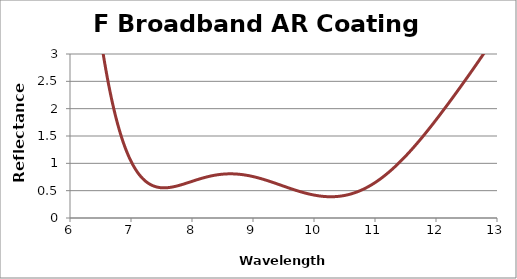
| Category | Reflectance (%) |
|---|---|
| 5.9999258 | 9.444 |
| 6.00962963 | 9.271 |
| 6.02007852 | 9.087 |
| 6.02977977 | 8.919 |
| 6.040225889999999 | 8.742 |
| 6.04992456 | 8.579 |
| 6.059621989999999 | 8.419 |
| 6.07006398 | 8.249 |
| 6.07975881 | 8.094 |
| 6.090198 | 7.93 |
| 6.09989023 | 7.78 |
| 6.10958121 | 7.632 |
| 6.12001623 | 7.475 |
| 6.12970459 | 7.332 |
| 6.1401368000000005 | 7.181 |
| 6.14982254 | 7.042 |
| 6.1595070100000004 | 6.906 |
| 6.16993502 | 6.762 |
| 6.17961685 | 6.63 |
| 6.19004202 | 6.491 |
| 6.1997212 | 6.363 |
| 6.20939912 | 6.238 |
| 6.21982005 | 6.105 |
| 6.22949531 | 5.984 |
| 6.23991337 | 5.856 |
| 6.24958596 | 5.739 |
| 6.25925726 | 5.624 |
| 6.26967107 | 5.503 |
| 6.27933969 | 5.392 |
| 6.2897506000000005 | 5.274 |
| 6.29941654 | 5.167 |
| 6.30982455 | 5.054 |
| 6.31948779 | 4.95 |
| 6.3298929 | 4.841 |
| 6.33955343 | 4.741 |
| 6.34921265 | 4.643 |
| 6.3596134300000005 | 4.54 |
| 6.369269940000001 | 4.445 |
| 6.37966779 | 4.345 |
| 6.38932158 | 4.254 |
| 6.399716489999999 | 4.158 |
| 6.409367530000001 | 4.071 |
| 6.419759490000001 | 3.978 |
| 6.4294078 | 3.894 |
| 6.43905478 | 3.811 |
| 6.44944235 | 3.723 |
| 6.45908657 | 3.644 |
| 6.469471169999999 | 3.559 |
| 6.4791126299999995 | 3.483 |
| 6.48949425 | 3.402 |
| 6.499132940000001 | 3.328 |
| 6.50951157 | 3.25 |
| 6.51914747 | 3.18 |
| 6.5295231000000005 | 3.105 |
| 6.53915621 | 3.037 |
| 6.54952883 | 2.965 |
| 6.559159139999999 | 2.9 |
| 6.56952874 | 2.831 |
| 6.57915625 | 2.769 |
| 6.58952282 | 2.703 |
| 6.59914751 | 2.643 |
| 6.60877084 | 2.584 |
| 6.61913291 | 2.522 |
| 6.62875342 | 2.466 |
| 6.63911243 | 2.407 |
| 6.6487301 | 2.353 |
| 6.65908605 | 2.296 |
| 6.66870088 | 2.245 |
| 6.6790537599999995 | 2.19 |
| 6.688665729999999 | 2.141 |
| 6.69901554 | 2.089 |
| 6.70862464 | 2.042 |
| 6.718971359999999 | 1.993 |
| 6.7293164800000005 | 1.944 |
| 6.73892122 | 1.9 |
| 6.74926324 | 1.854 |
| 6.7588650900000005 | 1.812 |
| 6.769203999999999 | 1.768 |
| 6.77880296 | 1.729 |
| 6.78913874 | 1.687 |
| 6.7987348 | 1.649 |
| 6.8090674600000005 | 1.609 |
| 6.81866061 | 1.573 |
| 6.82899013 | 1.535 |
| 6.83858036 | 1.501 |
| 6.8489067299999995 | 1.465 |
| 6.858494039999999 | 1.432 |
| 6.86881725 | 1.398 |
| 6.87840162 | 1.367 |
| 6.88872167 | 1.335 |
| 6.89904007 | 1.303 |
| 6.90861996 | 1.275 |
| 6.91893519 | 1.245 |
| 6.92851213 | 1.218 |
| 6.93882416 | 1.19 |
| 6.948398129999999 | 1.164 |
| 6.958706970000001 | 1.138 |
| 6.96827797 | 1.114 |
| 6.9785836 | 1.089 |
| 6.98888756 | 1.064 |
| 6.9984540299999995 | 1.042 |
| 7.0087547699999995 | 1.019 |
| 7.018318239999999 | 0.999 |
| 7.02861575 | 0.977 |
| 7.03817622 | 0.958 |
| 7.04847049 | 0.938 |
| 7.05876307 | 0.918 |
| 7.06831897 | 0.901 |
| 7.0786083 | 0.883 |
| 7.08816117 | 0.866 |
| 7.0984472400000005 | 0.849 |
| 7.1087316099999995 | 0.833 |
| 7.11827987 | 0.818 |
| 7.1285609700000006 | 0.803 |
| 7.138106179999999 | 0.789 |
| 7.14838399 | 0.775 |
| 7.1586601 | 0.761 |
| 7.16820066 | 0.749 |
| 7.17847347 | 0.737 |
| 7.1880109700000006 | 0.726 |
| 7.198280469999999 | 0.714 |
| 7.20854825 | 0.703 |
| 7.21808107 | 0.693 |
| 7.2283455299999995 | 0.683 |
| 7.23787527 | 0.674 |
| 7.24813639 | 0.665 |
| 7.25839579 | 0.656 |
| 7.2679208200000005 | 0.648 |
| 7.278176859999999 | 0.64 |
| 7.28843118 | 0.632 |
| 7.29795148 | 0.626 |
| 7.308202430000001 | 0.619 |
| 7.31845164 | 0.612 |
| 7.327967190000001 | 0.607 |
| 7.3382130299999995 | 0.601 |
| 7.3477254400000005 | 0.596 |
| 7.357967899999999 | 0.591 |
| 7.36820859 | 0.586 |
| 7.37771623 | 0.582 |
| 7.38795353 | 0.578 |
| 7.39818906 | 0.575 |
| 7.40769191 | 0.572 |
| 7.41792403 | 0.568 |
| 7.42815438 | 0.566 |
| 7.43765241 | 0.563 |
| 7.44787934 | 0.561 |
| 7.458104489999999 | 0.559 |
| 7.46759768 | 0.557 |
| 7.47781939 | 0.556 |
| 7.4880393199999995 | 0.554 |
| 7.49752765 | 0.553 |
| 7.50774413 | 0.553 |
| 7.51795881 | 0.552 |
| 7.5281717 | 0.552 |
| 7.537653489999999 | 0.552 |
| 7.5478629 | 0.552 |
| 7.55807052 | 0.552 |
| 7.56754741 | 0.552 |
| 7.57775154 | 0.553 |
| 7.58795386 | 0.553 |
| 7.597425820000001 | 0.554 |
| 7.60762465 | 0.555 |
| 7.61782166 | 0.557 |
| 7.62801685 | 0.558 |
| 7.63748218 | 0.56 |
| 7.64767385 | 0.561 |
| 7.6578637 | 0.563 |
| 7.667324069999999 | 0.565 |
| 7.67751039 | 0.567 |
| 7.6876948700000005 | 0.569 |
| 7.69787752 | 0.571 |
| 7.70733119 | 0.574 |
| 7.71751029 | 0.576 |
| 7.72768755 | 0.579 |
| 7.73786296 | 0.582 |
| 7.74730991 | 0.584 |
| 7.75748175 | 0.587 |
| 7.76765175 | 0.59 |
| 7.77781989 | 0.593 |
| 7.78726007 | 0.596 |
| 7.79742462 | 0.599 |
| 7.80758732 | 0.602 |
| 7.81774814 | 0.606 |
| 7.82718153 | 0.609 |
| 7.83733875 | 0.612 |
| 7.8474941 | 0.616 |
| 7.85764758 | 0.619 |
| 7.86707413 | 0.622 |
| 7.87722399 | 0.626 |
| 7.88737197 | 0.629 |
| 7.89751806 | 0.633 |
| 7.90693774 | 0.636 |
| 7.9170802 | 0.64 |
| 7.92722076 | 0.644 |
| 7.937359430000001 | 0.647 |
| 7.9474962 | 0.651 |
| 7.95690722 | 0.655 |
| 7.96704033 | 0.658 |
| 7.9771715400000005 | 0.662 |
| 7.98730085 | 0.666 |
| 7.9974282400000005 | 0.669 |
| 8.00683054 | 0.673 |
| 8.01695425 | 0.677 |
| 8.02707605 | 0.68 |
| 8.03719593 | 0.684 |
| 8.047313879999999 | 0.688 |
| 8.05670741 | 0.691 |
| 8.06682166 | 0.694 |
| 8.07693399 | 0.698 |
| 8.08704438 | 0.702 |
| 8.09715285 | 0.705 |
| 8.10725938 | 0.709 |
| 8.11664228 | 0.712 |
| 8.12674507 | 0.715 |
| 8.136845919999999 | 0.719 |
| 8.14694483 | 0.722 |
| 8.1570418 | 0.725 |
| 8.16713681 | 0.728 |
| 8.17722988 | 0.732 |
| 8.18660026 | 0.735 |
| 8.196689560000001 | 0.738 |
| 8.206776900000001 | 0.741 |
| 8.216862279999999 | 0.744 |
| 8.2269457 | 0.747 |
| 8.23702715 | 0.749 |
| 8.247106630000001 | 0.752 |
| 8.25646439 | 0.755 |
| 8.26654008 | 0.758 |
| 8.276613789999999 | 0.76 |
| 8.28668552 | 0.763 |
| 8.29675528 | 0.765 |
| 8.30682305 | 0.768 |
| 8.316888839999999 | 0.77 |
| 8.32695264 | 0.773 |
| 8.33701446 | 0.775 |
| 8.34635579 | 0.777 |
| 8.356413759999999 | 0.779 |
| 8.366469740000001 | 0.781 |
| 8.37652372 | 0.783 |
| 8.386575689999999 | 0.785 |
| 8.396625669999999 | 0.787 |
| 8.406673640000001 | 0.789 |
| 8.4167196 | 0.79 |
| 8.42676355 | 0.792 |
| 8.436805490000001 | 0.793 |
| 8.446845419999999 | 0.795 |
| 8.4561664 | 0.796 |
| 8.46620243 | 0.797 |
| 8.476236440000001 | 0.799 |
| 8.48626843 | 0.8 |
| 8.49629839 | 0.801 |
| 8.50632632 | 0.802 |
| 8.51635222 | 0.803 |
| 8.52637608 | 0.804 |
| 8.53639791 | 0.805 |
| 8.5464177 | 0.805 |
| 8.55643545 | 0.806 |
| 8.56645116 | 0.806 |
| 8.57646482 | 0.807 |
| 8.586476430000001 | 0.807 |
| 8.59648599 | 0.808 |
| 8.606493500000001 | 0.808 |
| 8.616498949999999 | 0.808 |
| 8.62650235 | 0.808 |
| 8.63650368 | 0.808 |
| 8.64650295 | 0.808 |
| 8.65650016 | 0.808 |
| 8.666495300000001 | 0.807 |
| 8.67648837 | 0.807 |
| 8.686479369999999 | 0.807 |
| 8.69646829 | 0.806 |
| 8.70645514 | 0.806 |
| 8.7164399 | 0.805 |
| 8.72642259 | 0.804 |
| 8.73640319 | 0.804 |
| 8.74638171 | 0.803 |
| 8.75635813 | 0.802 |
| 8.76633247 | 0.801 |
| 8.77630471 | 0.8 |
| 8.786274859999999 | 0.799 |
| 8.7962429 | 0.797 |
| 8.80620885 | 0.796 |
| 8.81617269 | 0.795 |
| 8.82613443 | 0.793 |
| 8.836094059999999 | 0.792 |
| 8.84605158 | 0.79 |
| 8.85600699 | 0.789 |
| 8.86596028 | 0.787 |
| 8.87591145 | 0.785 |
| 8.88586051 | 0.783 |
| 8.89580744 | 0.781 |
| 8.905752249999999 | 0.779 |
| 8.915694929999999 | 0.777 |
| 8.925635490000001 | 0.775 |
| 8.935573909999999 | 0.773 |
| 8.94551019 | 0.771 |
| 8.95544434 | 0.769 |
| 8.966085699999999 | 0.766 |
| 8.97601542 | 0.764 |
| 8.98594299 | 0.761 |
| 8.99586842 | 0.759 |
| 9.0057917 | 0.756 |
| 9.01571283 | 0.754 |
| 9.02563181 | 0.751 |
| 9.03554863 | 0.748 |
| 9.045463289999999 | 0.746 |
| 9.05537579 | 0.743 |
| 9.06528613 | 0.74 |
| 9.075901949999999 | 0.737 |
| 9.085807800000001 | 0.734 |
| 9.09571148 | 0.731 |
| 9.10561299 | 0.728 |
| 9.11551233 | 0.725 |
| 9.12540949 | 0.722 |
| 9.135304459999999 | 0.718 |
| 9.145197260000002 | 0.715 |
| 9.15579426 | 0.712 |
| 9.16568253 | 0.708 |
| 9.17556862 | 0.705 |
| 9.18545251 | 0.702 |
| 9.1953342 | 0.698 |
| 9.2052137 | 0.695 |
| 9.21509101 | 0.692 |
| 9.225671389999999 | 0.688 |
| 9.235544130000001 | 0.684 |
| 9.24541466 | 0.681 |
| 9.25528299 | 0.677 |
| 9.26514911 | 0.674 |
| 9.27501301 | 0.67 |
| 9.285579019999998 | 0.666 |
| 9.29543834 | 0.662 |
| 9.30529543 | 0.659 |
| 9.315150299999999 | 0.655 |
| 9.32500295 | 0.651 |
| 9.33555688 | 0.647 |
| 9.34540491 | 0.643 |
| 9.35525071 | 0.64 |
| 9.36509428 | 0.636 |
| 9.37493561 | 0.632 |
| 9.3854774 | 0.628 |
| 9.39531409 | 0.624 |
| 9.40514853 | 0.62 |
| 9.41498073 | 0.616 |
| 9.42481068 | 0.613 |
| 9.435340270000001 | 0.609 |
| 9.44516556 | 0.605 |
| 9.454988590000001 | 0.601 |
| 9.464809359999999 | 0.597 |
| 9.475329100000002 | 0.593 |
| 9.485145189999999 | 0.589 |
| 9.49495901 | 0.585 |
| 9.50477056 | 0.581 |
| 9.51528042 | 0.577 |
| 9.52508727 | 0.573 |
| 9.53489184 | 0.57 |
| 9.544694139999999 | 0.566 |
| 9.555194069999999 | 0.562 |
| 9.56499164 | 0.558 |
| 9.57478693 | 0.554 |
| 9.58457993 | 0.55 |
| 9.595069890000001 | 0.546 |
| 9.60485815 | 0.543 |
| 9.614644109999999 | 0.539 |
| 9.62512652 | 0.535 |
| 9.63490773 | 0.531 |
| 9.64468663 | 0.528 |
| 9.65446323 | 0.524 |
| 9.664935600000002 | 0.52 |
| 9.67470742 | 0.517 |
| 9.68447693 | 0.513 |
| 9.6949417 | 0.509 |
| 9.70470642 | 0.506 |
| 9.71446882 | 0.502 |
| 9.72492596 | 0.499 |
| 9.73468355 | 0.495 |
| 9.74443881 | 0.492 |
| 9.754888300000001 | 0.489 |
| 9.76463875 | 0.485 |
| 9.77438686 | 0.482 |
| 9.784828670000001 | 0.479 |
| 9.79457195 | 0.475 |
| 9.80431288 | 0.472 |
| 9.814746999999999 | 0.469 |
| 9.82448308 | 0.466 |
| 9.83421681 | 0.463 |
| 9.844643210000001 | 0.46 |
| 9.85437208 | 0.457 |
| 9.86479325 | 0.454 |
| 9.87451724 | 0.451 |
| 9.884238869999999 | 0.448 |
| 9.89465229 | 0.445 |
| 9.90436903 | 0.443 |
| 9.914083399999999 | 0.44 |
| 9.92448903 | 0.437 |
| 9.9341985 | 0.435 |
| 9.94459887 | 0.432 |
| 9.95430342 | 0.43 |
| 9.964005590000001 | 0.428 |
| 9.974398129999999 | 0.425 |
| 9.984095380000001 | 0.423 |
| 9.99448263 | 0.421 |
| 10.00417493 | 0.419 |
| 10.01455689 | 0.417 |
| 10.02424423 | 0.415 |
| 10.03392919 | 0.413 |
| 10.044303260000001 | 0.411 |
| 10.05398325 | 0.409 |
| 10.064352000000001 | 0.407 |
| 10.07402701 | 0.406 |
| 10.08439043 | 0.404 |
| 10.09406045 | 0.403 |
| 10.10441852 | 0.401 |
| 10.11408355 | 0.4 |
| 10.12443625 | 0.399 |
| 10.13409628 | 0.397 |
| 10.14375388 | 0.396 |
| 10.154098620000001 | 0.395 |
| 10.163751210000001 | 0.394 |
| 10.17409056 | 0.393 |
| 10.18373812 | 0.392 |
| 10.19407208 | 0.392 |
| 10.203714589999999 | 0.391 |
| 10.21404315 | 0.391 |
| 10.223680609999999 | 0.39 |
| 10.23400375 | 0.39 |
| 10.24363615 | 0.389 |
| 10.25395386 | 0.389 |
| 10.2635812 | 0.389 |
| 10.27389347 | 0.389 |
| 10.28420293 | 0.389 |
| 10.293822550000002 | 0.389 |
| 10.30412656 | 0.389 |
| 10.31374108 | 0.389 |
| 10.32403963 | 0.39 |
| 10.333649040000001 | 0.39 |
| 10.34394211 | 0.391 |
| 10.35354642 | 0.392 |
| 10.363834 | 0.392 |
| 10.37343318 | 0.393 |
| 10.38371527 | 0.394 |
| 10.39399451 | 0.395 |
| 10.4035859 | 0.396 |
| 10.413859619999998 | 0.397 |
| 10.42344586 | 0.399 |
| 10.43371407 | 0.4 |
| 10.44397941 | 0.402 |
| 10.45355782 | 0.403 |
| 10.46381763 | 0.405 |
| 10.47339086 | 0.407 |
| 10.483645119999998 | 0.409 |
| 10.4938965 | 0.411 |
| 10.503461869999999 | 0.413 |
| 10.513707689999999 | 0.415 |
| 10.52326785 | 0.417 |
| 10.533508099999999 | 0.42 |
| 10.543745450000001 | 0.422 |
| 10.55329771 | 0.425 |
| 10.56352948 | 0.428 |
| 10.57375835 | 0.43 |
| 10.583302680000001 | 0.433 |
| 10.59352594 | 0.436 |
| 10.603746300000001 | 0.44 |
| 10.613282680000001 | 0.443 |
| 10.62349742 | 0.446 |
| 10.63370924 | 0.449 |
| 10.643237639999999 | 0.453 |
| 10.65344383 | 0.457 |
| 10.66364709 | 0.46 |
| 10.6731675 | 0.464 |
| 10.68336511 | 0.468 |
| 10.69355979 | 0.472 |
| 10.70307218 | 0.476 |
| 10.713261189999999 | 0.48 |
| 10.72344726 | 0.485 |
| 10.73295161 | 0.489 |
| 10.743132 | 0.494 |
| 10.75330944 | 0.499 |
| 10.76348393 | 0.503 |
| 10.772977469999999 | 0.508 |
| 10.78314625 | 0.513 |
| 10.79331208 | 0.518 |
| 10.80347495 | 0.524 |
| 10.812957619999999 | 0.529 |
| 10.82311477 | 0.534 |
| 10.83326894 | 0.54 |
| 10.84274349 | 0.545 |
| 10.85289192 | 0.551 |
| 10.86303737 | 0.557 |
| 10.87317985 | 0.563 |
| 10.883319349999999 | 0.569 |
| 10.892780179999999 | 0.575 |
| 10.902913909999999 | 0.581 |
| 10.91304464 | 0.588 |
| 10.92317239 | 0.594 |
| 10.93262225 | 0.6 |
| 10.9427442 | 0.607 |
| 10.952863149999999 | 0.614 |
| 10.9629791 | 0.621 |
| 10.97309204 | 0.628 |
| 10.98320197 | 0.635 |
| 10.9926352 | 0.642 |
| 11.00273931 | 0.649 |
| 11.0128404 | 0.657 |
| 11.02293848 | 0.664 |
| 11.03303353 | 0.672 |
| 11.04312556 | 0.68 |
| 11.05254205 | 0.687 |
| 11.06262822 | 0.695 |
| 11.07271136 | 0.703 |
| 11.08279147 | 0.711 |
| 11.09286853 | 0.719 |
| 11.102942559999999 | 0.728 |
| 11.11301354 | 0.736 |
| 11.122410369999999 | 0.744 |
| 11.13247546 | 0.753 |
| 11.14253749 | 0.761 |
| 11.15259647 | 0.77 |
| 11.1626524 | 0.779 |
| 11.17270526 | 0.788 |
| 11.18275506 | 0.797 |
| 11.192801789999999 | 0.806 |
| 11.20284546 | 0.816 |
| 11.21288605 | 0.825 |
| 11.222254499999998 | 0.834 |
| 11.23228915 | 0.843 |
| 11.24232072 | 0.853 |
| 11.252349200000001 | 0.863 |
| 11.26237461 | 0.873 |
| 11.272396919999998 | 0.882 |
| 11.282416139999999 | 0.892 |
| 11.292432280000002 | 0.902 |
| 11.30244531 | 0.913 |
| 11.312455250000001 | 0.923 |
| 11.32246208 | 0.933 |
| 11.33246581 | 0.944 |
| 11.34246644 | 0.954 |
| 11.352463949999999 | 0.965 |
| 11.36245835 | 0.975 |
| 11.372449640000001 | 0.986 |
| 11.382437809999999 | 0.997 |
| 11.39242286 | 1.008 |
| 11.402404780000001 | 1.019 |
| 11.41238358 | 1.03 |
| 11.42235925 | 1.041 |
| 11.432331790000001 | 1.052 |
| 11.44230119 | 1.063 |
| 11.45226746 | 1.075 |
| 11.462230589999999 | 1.086 |
| 11.472190580000001 | 1.097 |
| 11.482147419999999 | 1.109 |
| 11.49210111 | 1.121 |
| 11.50205165 | 1.132 |
| 11.511999040000001 | 1.144 |
| 11.52194327 | 1.156 |
| 11.53188435 | 1.168 |
| 11.54182226 | 1.18 |
| 11.55175701 | 1.192 |
| 11.56235058 | 1.205 |
| 11.572278780000001 | 1.217 |
| 11.582203810000001 | 1.229 |
| 11.592125659999999 | 1.241 |
| 11.60204433 | 1.254 |
| 11.61195982 | 1.266 |
| 11.62187213 | 1.279 |
| 11.63178126 | 1.291 |
| 11.64168719 | 1.304 |
| 11.65225 | 1.317 |
| 11.66214934 | 1.33 |
| 11.672045480000001 | 1.343 |
| 11.68193842 | 1.355 |
| 11.69182815 | 1.368 |
| 11.701714679999998 | 1.381 |
| 11.711598 | 1.394 |
| 11.72213667 | 1.408 |
| 11.732013360000002 | 1.421 |
| 11.74188682 | 1.434 |
| 11.75175707 | 1.447 |
| 11.7616241 | 1.461 |
| 11.7714879 | 1.474 |
| 11.782005730000002 | 1.488 |
| 11.791862859999998 | 1.502 |
| 11.80171676 | 1.515 |
| 11.81156742 | 1.528 |
| 11.82141484 | 1.542 |
| 11.83191518 | 1.556 |
| 11.84175591 | 1.57 |
| 11.85159338 | 1.584 |
| 11.86142761 | 1.597 |
| 11.871913860000001 | 1.612 |
| 11.88174137 | 1.626 |
| 11.891565609999999 | 1.639 |
| 11.9013866 | 1.653 |
| 11.91185872 | 1.668 |
| 11.92167295 | 1.682 |
| 11.93148393 | 1.696 |
| 11.94129162 | 1.71 |
| 11.95174956 | 1.725 |
| 11.96155049 | 1.739 |
| 11.97134814 | 1.753 |
| 11.98114251 | 1.767 |
| 11.991586219999999 | 1.782 |
| 12.0013738 | 1.796 |
| 12.01115808 | 1.81 |
| 12.02159103 | 1.826 |
| 12.03136851 | 1.84 |
| 12.041142690000001 | 1.854 |
| 12.05156484 | 1.869 |
| 12.0613322 | 1.884 |
| 12.07109625 | 1.898 |
| 12.08150758 | 1.914 |
| 12.091264789999999 | 1.928 |
| 12.10101868 | 1.942 |
| 12.11141918 | 1.958 |
| 12.12116621 | 1.972 |
| 12.13155938 | 1.988 |
| 12.14129954 | 2.002 |
| 12.15103637 | 2.017 |
| 12.161418659999999 | 2.032 |
| 12.1711486 | 2.047 |
| 12.18087521 | 2.062 |
| 12.191246580000001 | 2.077 |
| 12.200966280000001 | 2.092 |
| 12.21133028 | 2.107 |
| 12.22104307 | 2.122 |
| 12.23139968 | 2.138 |
| 12.24110555 | 2.153 |
| 12.25080805 | 2.167 |
| 12.261153689999999 | 2.183 |
| 12.27084925 | 2.198 |
| 12.28118747 | 2.214 |
| 12.29087608 | 2.228 |
| 12.30120688 | 2.244 |
| 12.31088851 | 2.259 |
| 12.32121188 | 2.275 |
| 12.33088654 | 2.29 |
| 12.34120245 | 2.306 |
| 12.35087012 | 2.321 |
| 12.36117857 | 2.336 |
| 12.370839239999999 | 2.351 |
| 12.381140219999999 | 2.367 |
| 12.390793879999999 | 2.382 |
| 12.401087369999999 | 2.398 |
| 12.410734 | 2.413 |
| 12.42102 | 2.429 |
| 12.4306596 | 2.444 |
| 12.44093808 | 2.46 |
| 12.45057063 | 2.475 |
| 12.4608416 | 2.491 |
| 12.47046709 | 2.506 |
| 12.48073052 | 2.522 |
| 12.49099006 | 2.539 |
| 12.50060483 | 2.554 |
| 12.51085682 | 2.57 |
| 12.52046451 | 2.585 |
| 12.530708919999999 | 2.601 |
| 12.54094944 | 2.617 |
| 12.55054636 | 2.633 |
| 12.560779290000001 | 2.649 |
| 12.5703691 | 2.664 |
| 12.58059444 | 2.68 |
| 12.59081585 | 2.696 |
| 12.60039485 | 2.712 |
| 12.61060865 | 2.728 |
| 12.62081851 | 2.744 |
| 12.63038669 | 2.76 |
| 12.64058892 | 2.776 |
| 12.65078721 | 2.792 |
| 12.66034452 | 2.808 |
| 12.670535169999999 | 2.824 |
| 12.68072186 | 2.841 |
| 12.69026829 | 2.856 |
| 12.70044731 | 2.873 |
| 12.71062237 | 2.889 |
| 12.720157890000001 | 2.905 |
| 12.73032527 | 2.921 |
| 12.740488670000001 | 2.938 |
| 12.75064811 | 2.955 |
| 12.760168960000001 | 2.97 |
| 12.770320680000001 | 2.987 |
| 12.78046842 | 3.004 |
| 12.79061218 | 3.021 |
| 12.80011832 | 3.036 |
| 12.81025434 | 3.053 |
| 12.82038637 | 3.07 |
| 12.830514390000001 | 3.087 |
| 12.84000578 | 3.103 |
| 12.85012605 | 3.12 |
| 12.86024231 | 3.137 |
| 12.870354559999999 | 3.154 |
| 12.88046279 | 3.171 |
| 12.88993561 | 3.188 |
| 12.90003606 | 3.205 |
| 12.91013248 | 3.222 |
| 12.92022488 | 3.24 |
| 12.93031324 | 3.257 |
| 12.94039757 | 3.274 |
| 12.94984797 | 3.291 |
| 12.95992448 | 3.309 |
| 12.969996940000001 | 3.326 |
| 12.980065360000001 | 3.344 |
| 12.990129730000001 | 3.362 |
| 13.000190049999999 | 3.38 |